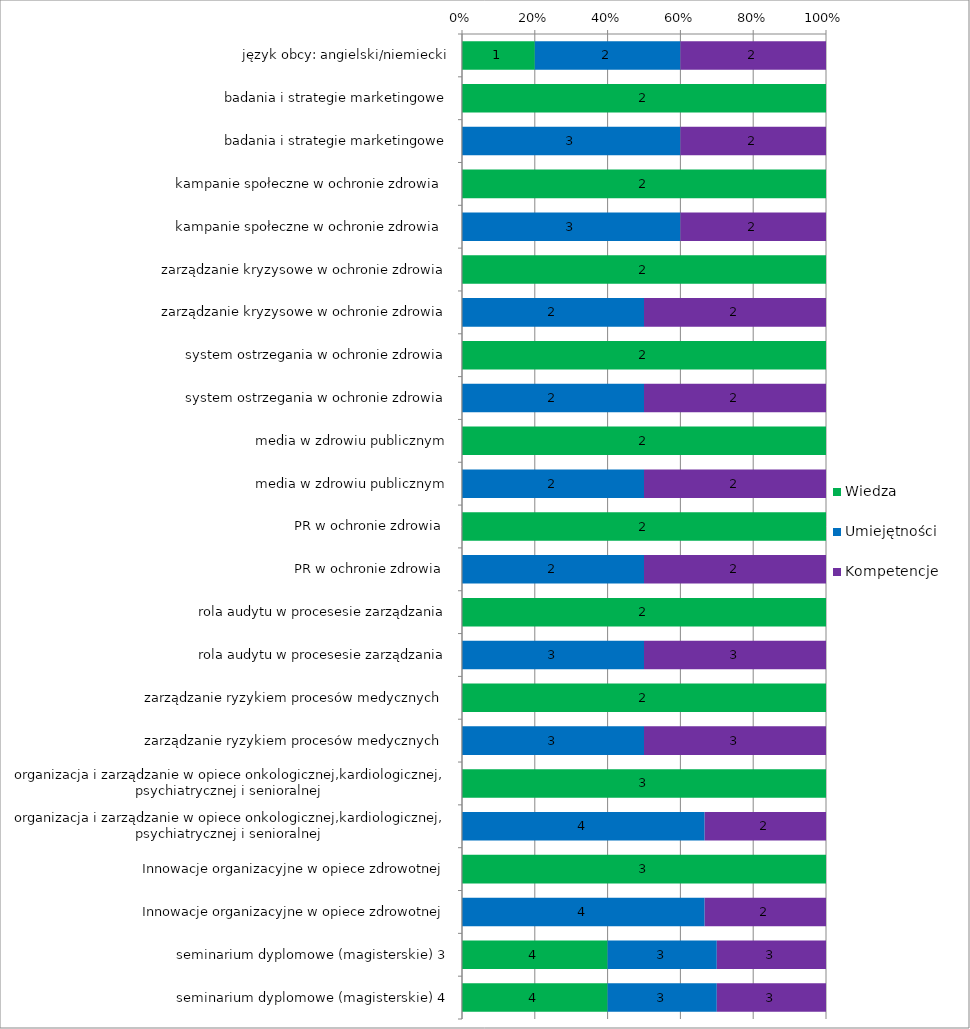
| Category | Wiedza | Umiejętności | Kompetencje |
|---|---|---|---|
| język obcy: angielski/niemiecki | 1 | 2 | 2 |
| badania i strategie marketingowe | 2 | 0 | 0 |
| badania i strategie marketingowe | 0 | 3 | 2 |
| kampanie społeczne w ochronie zdrowia  | 2 | 0 | 0 |
| kampanie społeczne w ochronie zdrowia  | 0 | 3 | 2 |
| zarządzanie kryzysowe w ochronie zdrowia | 2 | 0 | 0 |
| zarządzanie kryzysowe w ochronie zdrowia | 0 | 2 | 2 |
| system ostrzegania w ochronie zdrowia | 2 | 0 | 0 |
| system ostrzegania w ochronie zdrowia | 0 | 2 | 2 |
| media w zdrowiu publicznym | 2 | 0 | 0 |
| media w zdrowiu publicznym | 0 | 2 | 2 |
| PR w ochronie zdrowia  | 2 | 0 | 0 |
| PR w ochronie zdrowia  | 0 | 2 | 2 |
| rola audytu w procesesie zarządzania | 2 | 0 | 0 |
| rola audytu w procesesie zarządzania | 0 | 3 | 3 |
| zarządzanie ryzykiem procesów medycznych  | 2 | 0 | 0 |
| zarządzanie ryzykiem procesów medycznych  | 0 | 3 | 3 |
| organizacja i zarządzanie w opiece onkologicznej,kardiologicznej, psychiatrycznej i senioralnej  | 3 | 0 | 0 |
| organizacja i zarządzanie w opiece onkologicznej,kardiologicznej, psychiatrycznej i senioralnej  | 0 | 4 | 2 |
| Innowacje organizacyjne w opiece zdrowotnej | 3 | 0 | 0 |
| Innowacje organizacyjne w opiece zdrowotnej | 0 | 4 | 2 |
| seminarium dyplomowe (magisterskie) 3 | 4 | 3 | 3 |
| seminarium dyplomowe (magisterskie) 4 | 4 | 3 | 3 |